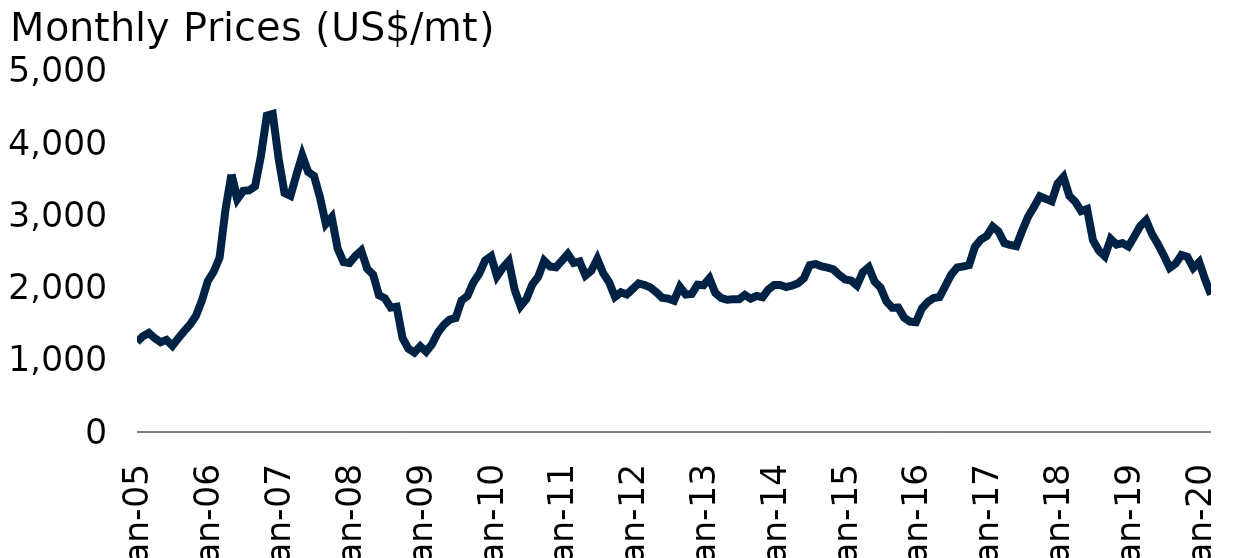
| Category | Zinc |
|---|---|
| 2005-01-01 | 1246.375 |
| 2005-02-01 | 1326.175 |
| 2005-03-01 | 1372.15 |
| 2005-04-01 | 1300.143 |
| 2005-05-01 | 1243.625 |
| 2005-06-01 | 1275.727 |
| 2005-07-01 | 1194.429 |
| 2005-08-01 | 1298.386 |
| 2005-09-01 | 1397.523 |
| 2005-10-01 | 1488.381 |
| 2005-11-01 | 1610.932 |
| 2005-12-01 | 1821.825 |
| 2006-01-01 | 2090.31 |
| 2006-02-01 | 2219.375 |
| 2006-03-01 | 2416.913 |
| 2006-04-01 | 3084.778 |
| 2006-05-01 | 3565.69 |
| 2006-06-01 | 3225.682 |
| 2006-07-01 | 3339.857 |
| 2006-08-01 | 3347.295 |
| 2006-09-01 | 3403.024 |
| 2006-10-01 | 3822.955 |
| 2006-11-01 | 4382.227 |
| 2006-12-01 | 4405.395 |
| 2007-01-01 | 3786.682 |
| 2007-02-01 | 3309.5 |
| 2007-03-01 | 3271.295 |
| 2007-04-01 | 3557.474 |
| 2007-05-01 | 3831.26 |
| 2007-06-01 | 3602.85 |
| 2007-07-01 | 3545.58 |
| 2007-08-01 | 3252.523 |
| 2007-09-01 | 2881.4 |
| 2007-10-01 | 2975.326 |
| 2007-11-01 | 2541.318 |
| 2007-12-01 | 2353.083 |
| 2008-01-01 | 2340.114 |
| 2008-02-01 | 2438.143 |
| 2008-03-01 | 2511.474 |
| 2008-04-01 | 2263.795 |
| 2008-05-01 | 2182.1 |
| 2008-06-01 | 1894.476 |
| 2008-07-01 | 1852.37 |
| 2008-08-01 | 1723.275 |
| 2008-09-01 | 1735.477 |
| 2008-10-01 | 1302.109 |
| 2008-11-01 | 1152.6 |
| 2008-12-01 | 1100.571 |
| 2009-01-01 | 1187.405 |
| 2009-02-01 | 1112.075 |
| 2009-03-01 | 1216.75 |
| 2009-04-01 | 1378.85 |
| 2009-05-01 | 1483.789 |
| 2009-06-01 | 1557.273 |
| 2009-07-01 | 1578.609 |
| 2009-08-01 | 1821.675 |
| 2009-09-01 | 1884.023 |
| 2009-10-01 | 2071.591 |
| 2009-11-01 | 2193.381 |
| 2009-12-01 | 2375.952 |
| 2010-01-01 | 2434.45 |
| 2010-02-01 | 2156.9 |
| 2010-03-01 | 2275.065 |
| 2010-04-01 | 2366.675 |
| 2010-05-01 | 1968.368 |
| 2010-06-01 | 1742.841 |
| 2010-07-01 | 1843.886 |
| 2010-08-01 | 2044.571 |
| 2010-09-01 | 2151.409 |
| 2010-10-01 | 2372.143 |
| 2010-11-01 | 2291.682 |
| 2010-12-01 | 2280.929 |
| 2011-01-01 | 2371.55 |
| 2011-02-01 | 2465.125 |
| 2011-03-01 | 2341.48 |
| 2011-04-01 | 2362.22 |
| 2011-05-01 | 2167.35 |
| 2011-06-01 | 2234.47 |
| 2011-07-01 | 2397.75 |
| 2011-08-01 | 2200.17 |
| 2011-09-01 | 2075.22 |
| 2011-10-01 | 1871.42 |
| 2011-11-01 | 1935.32 |
| 2011-12-01 | 1904.73 |
| 2012-01-01 | 1981.86 |
| 2012-02-01 | 2057.79 |
| 2012-03-01 | 2035.92 |
| 2012-04-01 | 2002.14 |
| 2012-05-01 | 1936 |
| 2012-06-01 | 1858.702 |
| 2012-07-01 | 1847.75 |
| 2012-08-01 | 1818.163 |
| 2012-09-01 | 2009.85 |
| 2012-10-01 | 1903.96 |
| 2012-11-01 | 1912.398 |
| 2012-12-01 | 2040.429 |
| 2013-01-01 | 2032.2 |
| 2013-02-01 | 2128.688 |
| 2013-03-01 | 1926.071 |
| 2013-04-01 | 1856.005 |
| 2013-05-01 | 1831.554 |
| 2013-06-01 | 1839.012 |
| 2013-07-01 | 1837.62 |
| 2013-08-01 | 1898.818 |
| 2013-09-01 | 1846.881 |
| 2013-10-01 | 1884.837 |
| 2013-11-01 | 1866.417 |
| 2013-12-01 | 1974.975 |
| 2014-01-01 | 2036.93 |
| 2014-02-01 | 2034.53 |
| 2014-03-01 | 2007.9 |
| 2014-04-01 | 2027.21 |
| 2014-05-01 | 2058.97 |
| 2014-06-01 | 2128.1 |
| 2014-07-01 | 2310.62 |
| 2014-08-01 | 2326.99 |
| 2014-09-01 | 2294.59 |
| 2014-10-01 | 2276.83 |
| 2014-11-01 | 2253.22 |
| 2014-12-01 | 2175.76 |
| 2015-01-01 | 2113.05 |
| 2015-02-01 | 2097.76 |
| 2015-03-01 | 2028.73 |
| 2015-04-01 | 2212.72 |
| 2015-05-01 | 2281.8 |
| 2015-06-01 | 2082.09 |
| 2015-07-01 | 2000.68 |
| 2015-08-01 | 1807.64 |
| 2015-09-01 | 1720.23 |
| 2015-10-01 | 1724.34 |
| 2015-11-01 | 1583.31 |
| 2015-12-01 | 1527.79 |
| 2016-01-01 | 1520.36 |
| 2016-02-01 | 1709.85 |
| 2016-03-01 | 1801.69 |
| 2016-04-01 | 1855.37 |
| 2016-05-01 | 1869.03 |
| 2016-06-01 | 2026.19 |
| 2016-07-01 | 2183.25 |
| 2016-08-01 | 2279.14 |
| 2016-09-01 | 2292.31 |
| 2016-10-01 | 2311.5 |
| 2016-11-01 | 2566.2 |
| 2016-12-01 | 2664.81 |
| 2017-01-01 | 2714.8 |
| 2017-02-01 | 2845.55 |
| 2017-03-01 | 2776.88 |
| 2017-04-01 | 2614.92 |
| 2017-05-01 | 2590.21 |
| 2017-06-01 | 2573.4 |
| 2017-07-01 | 2787.19 |
| 2017-08-01 | 2980.73 |
| 2017-09-01 | 3116.86 |
| 2017-10-01 | 3264.6 |
| 2017-11-01 | 3229.31 |
| 2017-12-01 | 3195.95 |
| 2018-01-01 | 3441.52 |
| 2018-02-01 | 3532.9 |
| 2018-03-01 | 3269.18 |
| 2018-04-01 | 3188.05 |
| 2018-05-01 | 3059.87 |
| 2018-06-01 | 3088.57 |
| 2018-07-01 | 2656.13 |
| 2018-08-01 | 2512 |
| 2018-09-01 | 2434.68 |
| 2018-10-01 | 2673.67 |
| 2018-11-01 | 2595.69 |
| 2018-12-01 | 2616.29 |
| 2019-01-01 | 2569.7 |
| 2019-02-01 | 2707.19 |
| 2019-03-01 | 2850.6 |
| 2019-04-01 | 2932.65 |
| 2019-05-01 | 2742.81 |
| 2019-06-01 | 2601.22 |
| 2019-07-01 | 2446.51 |
| 2019-08-01 | 2273.01 |
| 2019-09-01 | 2331.56 |
| 2019-10-01 | 2451.65 |
| 2019-11-01 | 2425.48 |
| 2019-12-01 | 2272.54 |
| 2020-01-01 | 2354.31 |
| 2020-02-01 | 2113.24 |
| 2020-03-01 | 1903.63 |